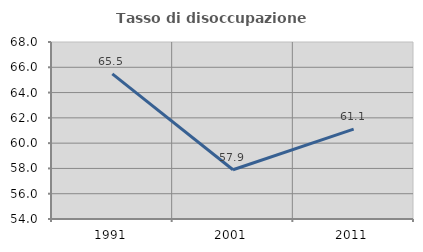
| Category | Tasso di disoccupazione giovanile  |
|---|---|
| 1991.0 | 65.476 |
| 2001.0 | 57.895 |
| 2011.0 | 61.111 |